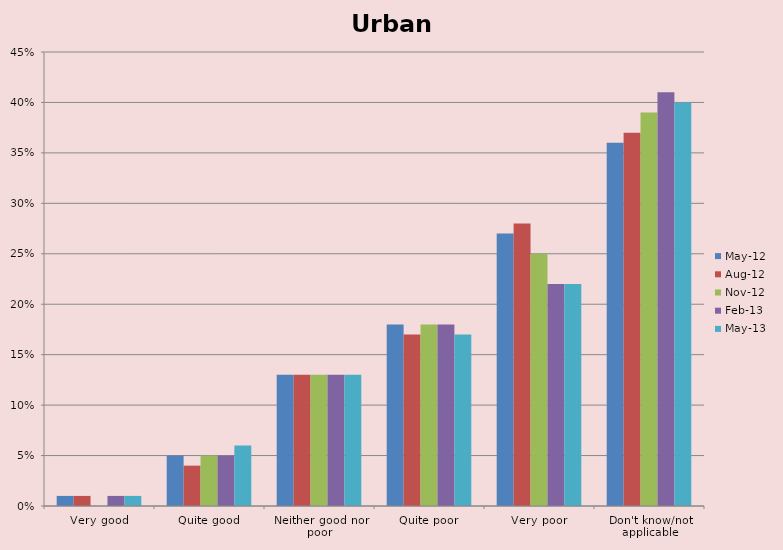
| Category | May-12 | Aug-12 | Nov-12 | Feb-13 | May-13 |
|---|---|---|---|---|---|
| Very good | 0.01 | 0.01 | 0 | 0.01 | 0.01 |
| Quite good | 0.05 | 0.04 | 0.05 | 0.05 | 0.06 |
| Neither good nor poor | 0.13 | 0.13 | 0.13 | 0.13 | 0.13 |
| Quite poor | 0.18 | 0.17 | 0.18 | 0.18 | 0.17 |
| Very poor | 0.27 | 0.28 | 0.25 | 0.22 | 0.22 |
| Don't know/not applicable | 0.36 | 0.37 | 0.39 | 0.41 | 0.4 |